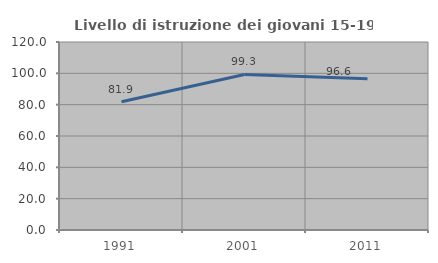
| Category | Livello di istruzione dei giovani 15-19 anni |
|---|---|
| 1991.0 | 81.862 |
| 2001.0 | 99.298 |
| 2011.0 | 96.578 |